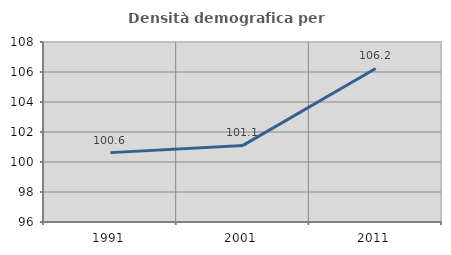
| Category | Densità demografica |
|---|---|
| 1991.0 | 100.625 |
| 2001.0 | 101.107 |
| 2011.0 | 106.237 |